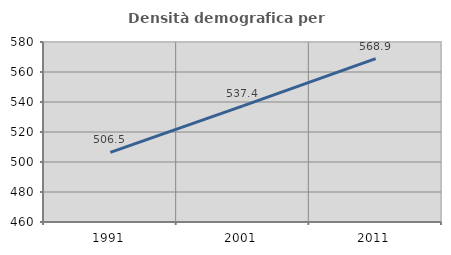
| Category | Densità demografica |
|---|---|
| 1991.0 | 506.45 |
| 2001.0 | 537.373 |
| 2011.0 | 568.872 |